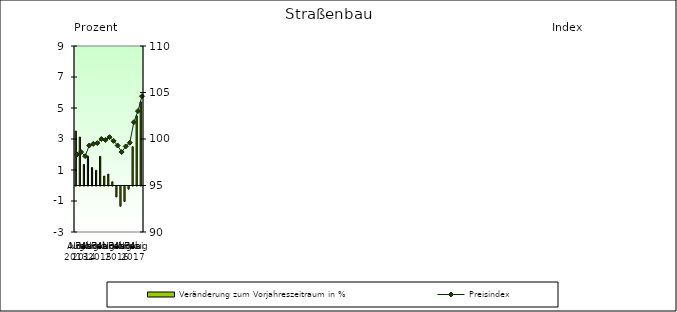
| Category | Veränderung zum Vorjahreszeitraum in % |
|---|---|
| 0 | 3.512 |
| 1 | 3.122 |
| 2 | 1.36 |
| 3 | 1.892 |
| 4 | 1.161 |
| 5 | 0.98 |
| 6 | 1.878 |
| 7 | 0.607 |
| 8 | 0.731 |
| 9 | 0.24 |
| 10 | -0.7 |
| 11 | -1.3 |
| 12 | -1 |
| 13 | -0.2 |
| 14 | 2.5 |
| 15 | 4.5 |
| 16 | 5.4 |